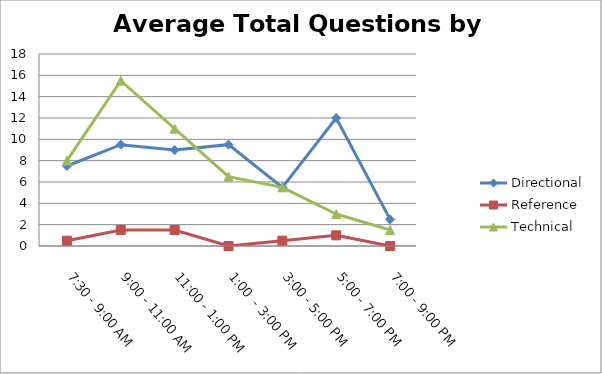
| Category | Directional | Reference | Technical |
|---|---|---|---|
| 7:30 - 9:00 AM | 7.5 | 0.5 | 8 |
| 9:00 - 11:00 AM | 9.5 | 1.5 | 15.5 |
| 11:00 - 1:00 PM | 9 | 1.5 | 11 |
| 1:00  - 3:00 PM | 9.5 | 0 | 6.5 |
| 3:00 - 5:00 PM | 5.5 | 0.5 | 5.5 |
| 5:00 - 7:00 PM | 12 | 1 | 3 |
| 7:00 - 9:00 PM | 2.5 | 0 | 1.5 |